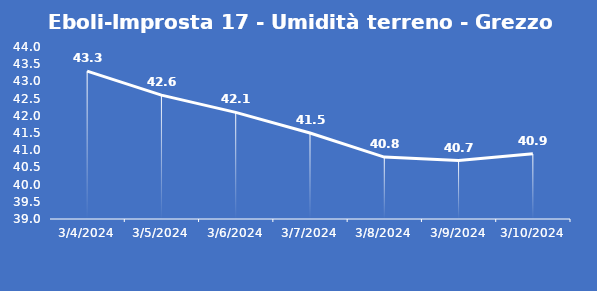
| Category | Eboli-Improsta 17 - Umidità terreno - Grezzo (%VWC) |
|---|---|
| 3/4/24 | 43.3 |
| 3/5/24 | 42.6 |
| 3/6/24 | 42.1 |
| 3/7/24 | 41.5 |
| 3/8/24 | 40.8 |
| 3/9/24 | 40.7 |
| 3/10/24 | 40.9 |